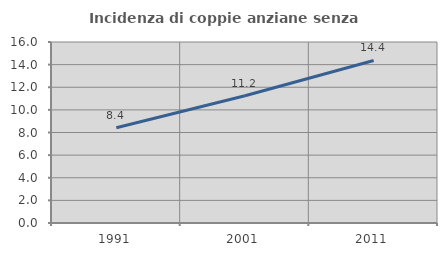
| Category | Incidenza di coppie anziane senza figli  |
|---|---|
| 1991.0 | 8.425 |
| 2001.0 | 11.248 |
| 2011.0 | 14.365 |